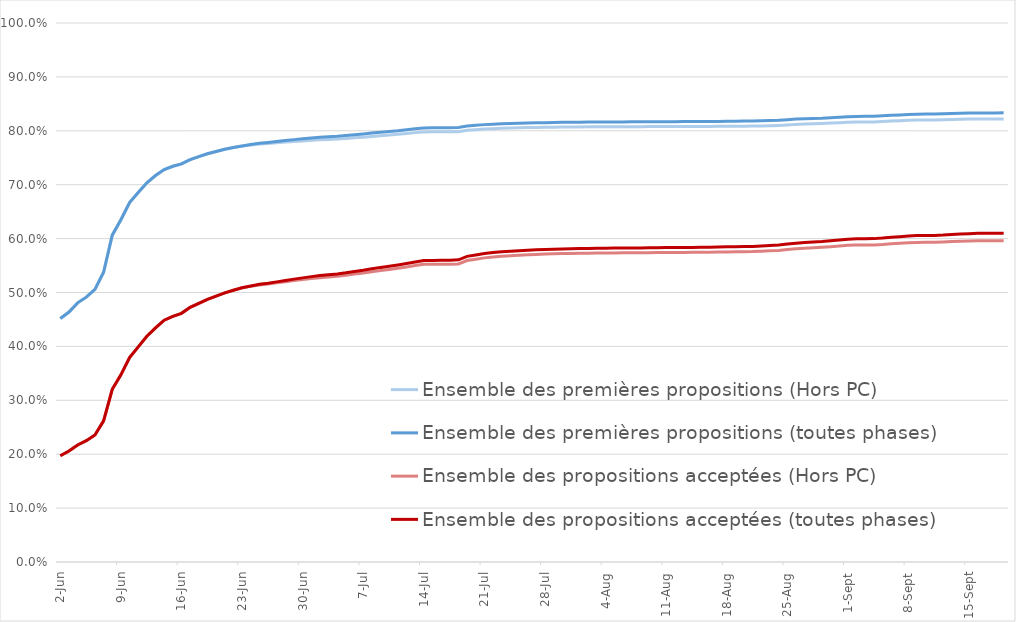
| Category | Ensemble des premières propositions (Hors PC) | Ensemble des premières propositions (toutes phases) | Ensemble des propositions acceptées (Hors PC) | Ensemble des propositions acceptées (toutes phases) |
|---|---|---|---|---|
| 2022-06-02 | 0.452 | 0.452 | 0.197 | 0.197 |
| 2022-06-03 | 0.464 | 0.464 | 0.206 | 0.206 |
| 2022-06-04 | 0.481 | 0.481 | 0.217 | 0.217 |
| 2022-06-05 | 0.491 | 0.491 | 0.225 | 0.225 |
| 2022-06-06 | 0.506 | 0.506 | 0.236 | 0.236 |
| 2022-06-07 | 0.538 | 0.538 | 0.262 | 0.262 |
| 2022-06-08 | 0.606 | 0.606 | 0.32 | 0.32 |
| 2022-06-09 | 0.635 | 0.635 | 0.347 | 0.347 |
| 2022-06-10 | 0.667 | 0.667 | 0.379 | 0.379 |
| 2022-06-11 | 0.685 | 0.685 | 0.399 | 0.399 |
| 2022-06-12 | 0.704 | 0.704 | 0.419 | 0.419 |
| 2022-06-13 | 0.717 | 0.717 | 0.434 | 0.434 |
| 2022-06-14 | 0.728 | 0.728 | 0.449 | 0.449 |
| 2022-06-15 | 0.734 | 0.734 | 0.456 | 0.456 |
| 2022-06-16 | 0.739 | 0.739 | 0.461 | 0.461 |
| 2022-06-17 | 0.746 | 0.746 | 0.472 | 0.472 |
| 2022-06-18 | 0.752 | 0.752 | 0.48 | 0.48 |
| 2022-06-19 | 0.757 | 0.757 | 0.487 | 0.487 |
| 2022-06-20 | 0.762 | 0.762 | 0.493 | 0.493 |
| 2022-06-21 | 0.766 | 0.766 | 0.499 | 0.499 |
| 2022-06-22 | 0.769 | 0.769 | 0.504 | 0.504 |
| 2022-06-23 | 0.772 | 0.772 | 0.509 | 0.509 |
| 2022-06-24 | 0.774 | 0.775 | 0.511 | 0.512 |
| 2022-06-25 | 0.775 | 0.777 | 0.514 | 0.515 |
| 2022-06-26 | 0.776 | 0.778 | 0.516 | 0.517 |
| 2022-06-27 | 0.778 | 0.78 | 0.518 | 0.52 |
| 2022-06-28 | 0.779 | 0.782 | 0.52 | 0.522 |
| 2022-06-29 | 0.78 | 0.784 | 0.522 | 0.525 |
| 2022-06-30 | 0.781 | 0.785 | 0.524 | 0.527 |
| 2022-07-01 | 0.782 | 0.787 | 0.526 | 0.529 |
| 2022-07-02 | 0.783 | 0.788 | 0.528 | 0.531 |
| 2022-07-03 | 0.784 | 0.789 | 0.529 | 0.533 |
| 2022-07-04 | 0.785 | 0.79 | 0.53 | 0.535 |
| 2022-07-05 | 0.786 | 0.791 | 0.532 | 0.537 |
| 2022-07-06 | 0.787 | 0.793 | 0.534 | 0.539 |
| 2022-07-07 | 0.788 | 0.794 | 0.536 | 0.541 |
| 2022-07-08 | 0.79 | 0.796 | 0.539 | 0.544 |
| 2022-07-09 | 0.791 | 0.797 | 0.541 | 0.547 |
| 2022-07-10 | 0.792 | 0.799 | 0.543 | 0.549 |
| 2022-07-11 | 0.794 | 0.8 | 0.545 | 0.551 |
| 2022-07-12 | 0.795 | 0.802 | 0.547 | 0.554 |
| 2022-07-13 | 0.797 | 0.804 | 0.55 | 0.557 |
| 2022-07-14 | 0.798 | 0.805 | 0.552 | 0.559 |
| 2022-07-15 | 0.798 | 0.806 | 0.552 | 0.56 |
| 2022-07-16 | 0.798 | 0.806 | 0.552 | 0.56 |
| 2022-07-17 | 0.798 | 0.806 | 0.552 | 0.56 |
| 2022-07-18 | 0.798 | 0.806 | 0.553 | 0.561 |
| 2022-07-19 | 0.801 | 0.809 | 0.559 | 0.567 |
| 2022-07-20 | 0.802 | 0.81 | 0.562 | 0.57 |
| 2022-07-21 | 0.803 | 0.811 | 0.564 | 0.572 |
| 2022-07-22 | 0.804 | 0.812 | 0.566 | 0.574 |
| 2022-07-23 | 0.805 | 0.813 | 0.567 | 0.576 |
| 2022-07-24 | 0.805 | 0.814 | 0.568 | 0.577 |
| 2022-07-25 | 0.806 | 0.814 | 0.569 | 0.578 |
| 2022-07-26 | 0.806 | 0.814 | 0.57 | 0.578 |
| 2022-07-27 | 0.806 | 0.815 | 0.571 | 0.579 |
| 2022-07-28 | 0.807 | 0.815 | 0.571 | 0.58 |
| 2022-07-29 | 0.807 | 0.816 | 0.572 | 0.58 |
| 2022-07-30 | 0.807 | 0.816 | 0.572 | 0.581 |
| 2022-07-31 | 0.807 | 0.816 | 0.572 | 0.581 |
| 2022-08-01 | 0.807 | 0.816 | 0.573 | 0.582 |
| 2022-08-02 | 0.807 | 0.816 | 0.573 | 0.582 |
| 2022-08-03 | 0.807 | 0.816 | 0.573 | 0.582 |
| 2022-08-04 | 0.808 | 0.816 | 0.573 | 0.582 |
| 2022-08-05 | 0.808 | 0.816 | 0.573 | 0.582 |
| 2022-08-06 | 0.808 | 0.817 | 0.574 | 0.582 |
| 2022-08-07 | 0.808 | 0.817 | 0.574 | 0.583 |
| 2022-08-08 | 0.808 | 0.817 | 0.574 | 0.583 |
| 2022-08-09 | 0.808 | 0.817 | 0.574 | 0.583 |
| 2022-08-10 | 0.808 | 0.817 | 0.574 | 0.583 |
| 2022-08-11 | 0.808 | 0.817 | 0.574 | 0.583 |
| 2022-08-12 | 0.808 | 0.817 | 0.574 | 0.583 |
| 2022-08-13 | 0.808 | 0.817 | 0.574 | 0.584 |
| 2022-08-14 | 0.808 | 0.817 | 0.574 | 0.584 |
| 2022-08-15 | 0.808 | 0.817 | 0.575 | 0.584 |
| 2022-08-16 | 0.808 | 0.817 | 0.575 | 0.584 |
| 2022-08-17 | 0.808 | 0.817 | 0.575 | 0.584 |
| 2022-08-18 | 0.808 | 0.818 | 0.575 | 0.585 |
| 2022-08-19 | 0.809 | 0.818 | 0.576 | 0.585 |
| 2022-08-20 | 0.809 | 0.818 | 0.576 | 0.585 |
| 2022-08-21 | 0.809 | 0.818 | 0.576 | 0.586 |
| 2022-08-22 | 0.809 | 0.818 | 0.577 | 0.586 |
| 2022-08-23 | 0.809 | 0.819 | 0.577 | 0.587 |
| 2022-08-24 | 0.81 | 0.82 | 0.578 | 0.588 |
| 2022-08-25 | 0.811 | 0.821 | 0.58 | 0.59 |
| 2022-08-26 | 0.812 | 0.822 | 0.581 | 0.591 |
| 2022-08-27 | 0.813 | 0.822 | 0.582 | 0.593 |
| 2022-08-28 | 0.813 | 0.823 | 0.583 | 0.593 |
| 2022-08-29 | 0.813 | 0.823 | 0.584 | 0.594 |
| 2022-08-30 | 0.814 | 0.824 | 0.585 | 0.596 |
| 2022-08-31 | 0.815 | 0.825 | 0.586 | 0.597 |
| 2022-09-01 | 0.816 | 0.826 | 0.588 | 0.599 |
| 2022-09-02 | 0.816 | 0.827 | 0.588 | 0.6 |
| 2022-09-03 | 0.816 | 0.827 | 0.588 | 0.6 |
| 2022-09-04 | 0.816 | 0.827 | 0.588 | 0.6 |
| 2022-09-05 | 0.817 | 0.828 | 0.589 | 0.601 |
| 2022-09-06 | 0.818 | 0.829 | 0.591 | 0.602 |
| 2022-09-07 | 0.819 | 0.829 | 0.591 | 0.604 |
| 2022-09-08 | 0.82 | 0.83 | 0.592 | 0.605 |
| 2022-09-09 | 0.82 | 0.831 | 0.593 | 0.606 |
| 2022-09-10 | 0.82 | 0.831 | 0.593 | 0.606 |
| 2022-09-11 | 0.82 | 0.831 | 0.593 | 0.606 |
| 2022-09-12 | 0.82 | 0.831 | 0.594 | 0.607 |
| 2022-09-13 | 0.821 | 0.832 | 0.595 | 0.608 |
| 2022-09-14 | 0.821 | 0.833 | 0.595 | 0.609 |
| 2022-09-15 | 0.822 | 0.833 | 0.596 | 0.609 |
| 2022-09-16 | 0.822 | 0.833 | 0.596 | 0.61 |
| 2022-09-17 | 0.822 | 0.833 | 0.596 | 0.61 |
| 2022-09-18 | 0.822 | 0.833 | 0.596 | 0.61 |
| 2022-09-19 | 0.822 | 0.833 | 0.596 | 0.61 |